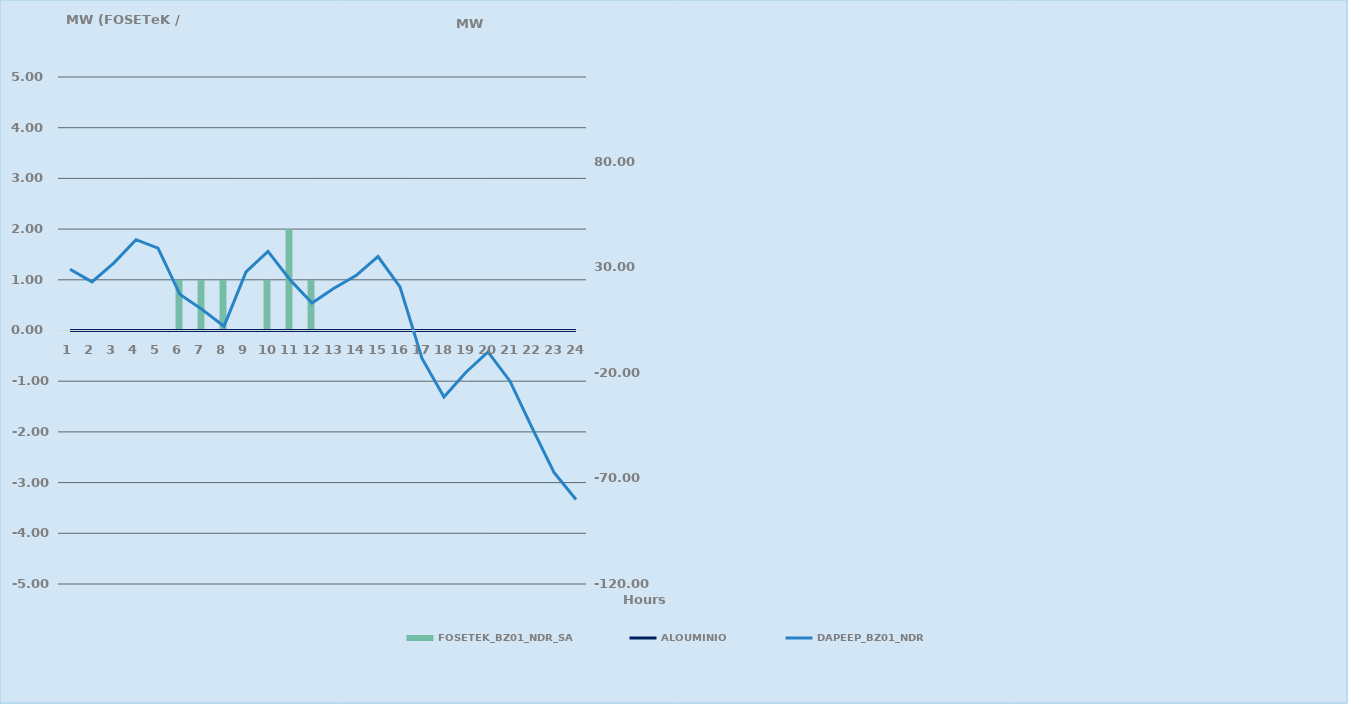
| Category | FOSETEK_BZ01_NDR_SA |
|---|---|
| 0 | 0 |
| 1 | 0 |
| 2 | 0 |
| 3 | 0 |
| 4 | 0 |
| 5 | 1 |
| 6 | 1 |
| 7 | 1 |
| 8 | 0 |
| 9 | 1 |
| 10 | 2 |
| 11 | 1 |
| 12 | 0 |
| 13 | 0 |
| 14 | 0 |
| 15 | 0 |
| 16 | 0 |
| 17 | 0 |
| 18 | 0 |
| 19 | 0 |
| 20 | 0 |
| 21 | 0 |
| 22 | 0 |
| 23 | 0 |